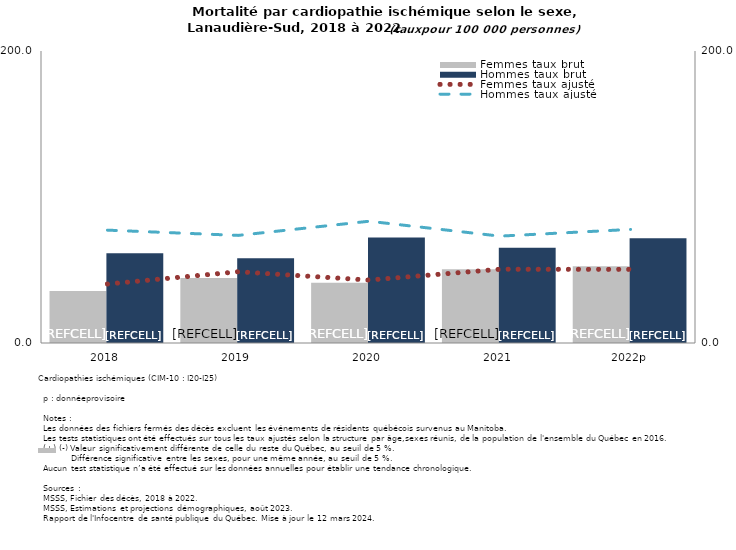
| Category | Femmes taux brut | Hommes taux brut |
|---|---|---|
| 2018 | 35.6 | 61.5 |
| 2019 | 44.5 | 58 |
| 2020 | 41.2 | 72.2 |
| 2021 | 50.5 | 65.3 |
| 2022p | 52.5 | 71.7 |